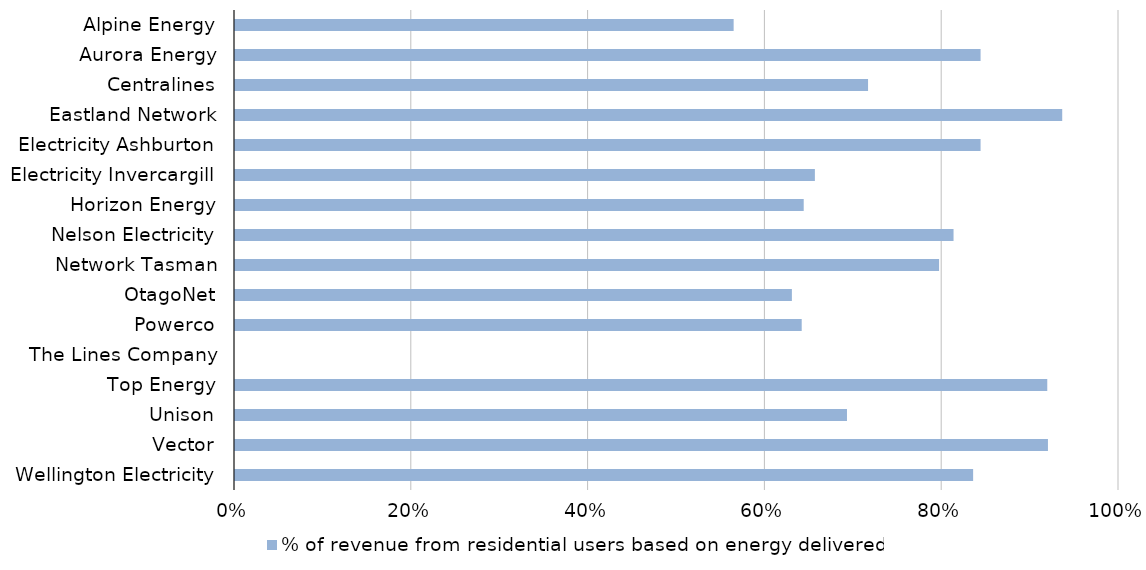
| Category | % of revenue from residential users based on energy delivered |
|---|---|
| Alpine Energy | 0.564 |
| Aurora Energy | 0.843 |
| Centralines | 0.716 |
| Eastland Network | 0.936 |
| Electricity Ashburton | 0.843 |
| Electricity Invercargill | 0.656 |
| Horizon Energy | 0.643 |
| Nelson Electricity | 0.813 |
| Network Tasman | 0.796 |
| OtagoNet | 0.63 |
| Powerco | 0.641 |
| The Lines Company | 0 |
| Top Energy | 0.919 |
| Unison | 0.692 |
| Vector | 0.92 |
| Wellington Electricity | 0.835 |